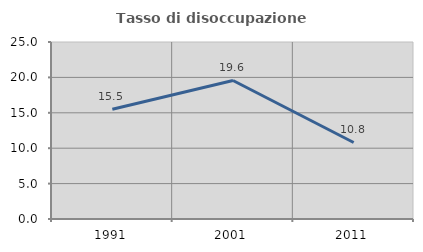
| Category | Tasso di disoccupazione giovanile  |
|---|---|
| 1991.0 | 15.493 |
| 2001.0 | 19.565 |
| 2011.0 | 10.811 |